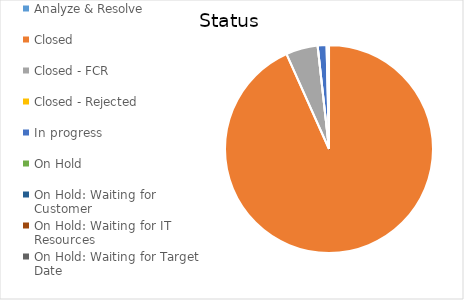
| Category | Series 0 |
|---|---|
| Analyze & Resolve  | 0 |
| Closed  | 1225 |
| Closed - FCR  | 65 |
| Closed - Rejected  | 0 |
| In progress  | 18 |
| On Hold  | 1 |
| On Hold: Waiting for Customer  | 2 |
| On Hold: Waiting for IT Resources  | 1 |
| On Hold: Waiting for Target Date  | 1 |